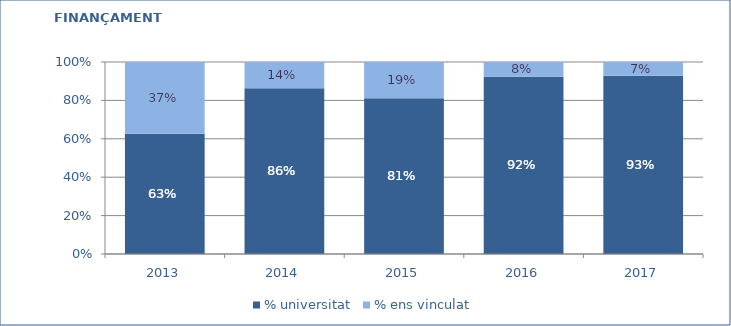
| Category | % universitat | % ens vinculat |
|---|---|---|
| 2013.0 | 0.626 | 0.374 |
| 2014.0 | 0.863 | 0.137 |
| 2015.0 | 0.811 | 0.189 |
| 2016.0 | 0.923 | 0.077 |
| 2017.0 | 0.928 | 0.072 |